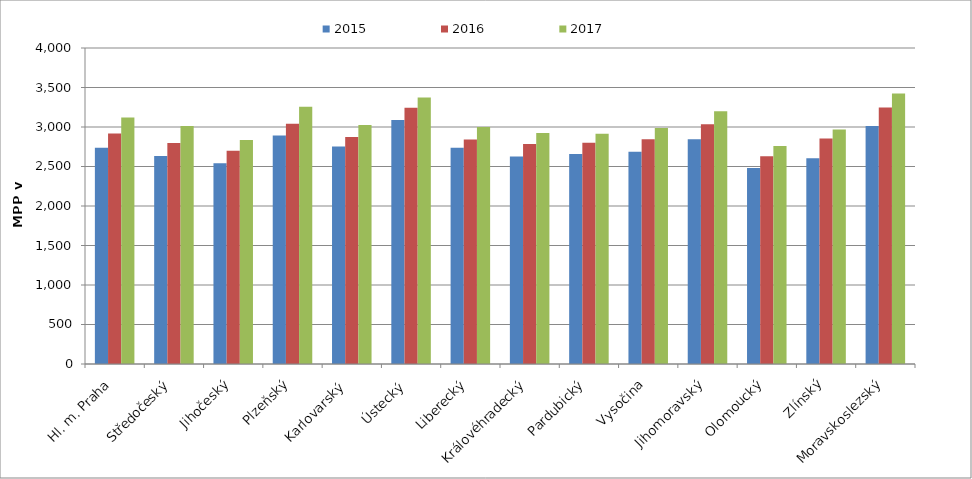
| Category | 2015 | 2016 | 2017 |
|---|---|---|---|
| Hl. m. Praha | 2737.854 | 2917.082 | 3121.236 |
| Středočeský | 2632.572 | 2797.358 | 3011.084 |
| Jihočeský | 2540.172 | 2700.229 | 2834.883 |
| Plzeňský | 2893.039 | 3042.218 | 3255.235 |
| Karlovarský  | 2754.069 | 2873.811 | 3026.21 |
| Ústecký   | 3089.746 | 3244.256 | 3374.017 |
| Liberecký | 2736.774 | 2843.299 | 2999.253 |
| Královéhradecký | 2626.821 | 2784.53 | 2923.757 |
| Pardubický | 2658.611 | 2800.921 | 2913.044 |
| Vysočina | 2685.956 | 2843.813 | 2988.301 |
| Jihomoravský | 2844.514 | 3036.297 | 3198.128 |
| Olomoucký | 2480.169 | 2628.999 | 2760.468 |
| Zlínský | 2604.139 | 2855.837 | 2966.897 |
| Moravskoslezský | 3012.441 | 3246 | 3424.745 |